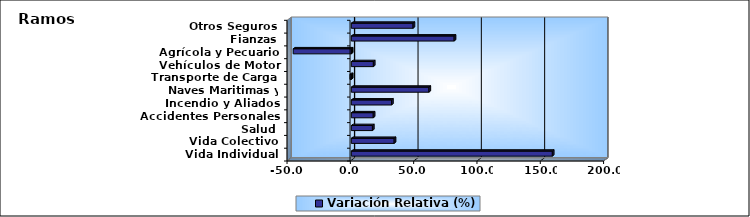
| Category | Variación Relativa (%) |
|---|---|
| Vida Individual | 158.744 |
| Vida Colectivo | 33.815 |
| Salud | 16.659 |
| Accidentes Personales | 17.313 |
| Incendio y Aliados | 31.761 |
| Naves Maritimas y Aéreas | 61.279 |
| Transporte de Carga | -1.073 |
| Vehículos de Motor | 17.414 |
| Agrícola y Pecuario | -45.911 |
| Fianzas | 81.189 |
| Otros Seguros | 48.734 |